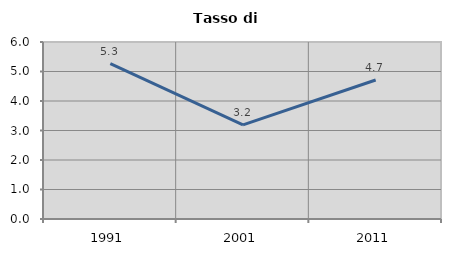
| Category | Tasso di disoccupazione   |
|---|---|
| 1991.0 | 5.268 |
| 2001.0 | 3.192 |
| 2011.0 | 4.713 |